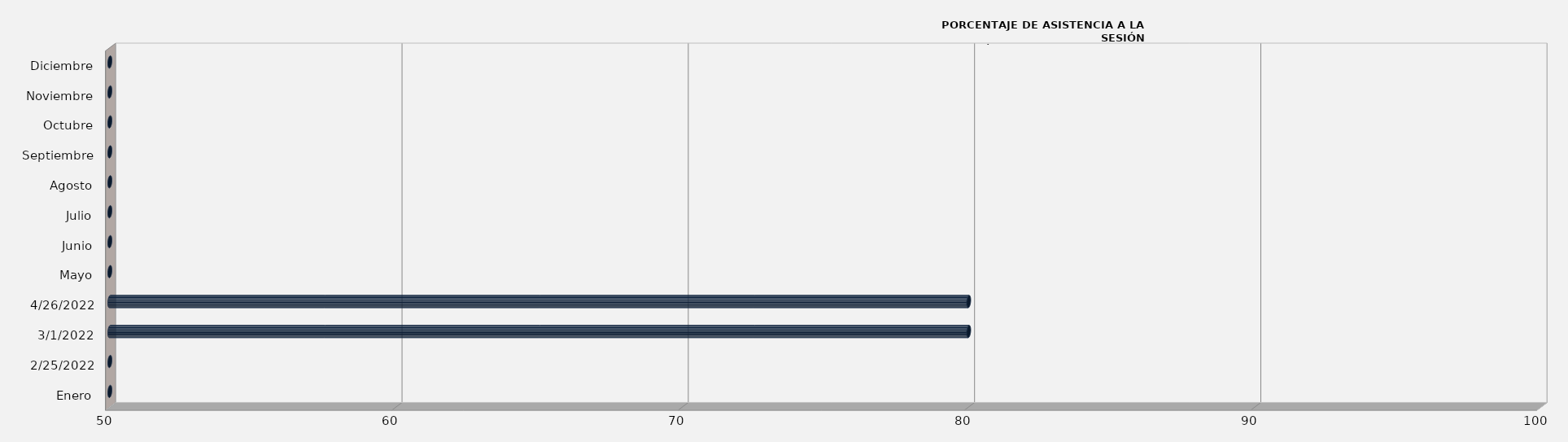
| Category | Series 0 |
|---|---|
| Enero | 0 |
| 25/02/2022 | 0 |
| 01/03/2022 | 80 |
| 26/04/2022 | 80 |
| Mayo | 0 |
| Junio | 0 |
| Julio | 0 |
| Agosto | 0 |
| Septiembre | 0 |
| Octubre | 0 |
| Noviembre | 0 |
| Diciembre | 0 |